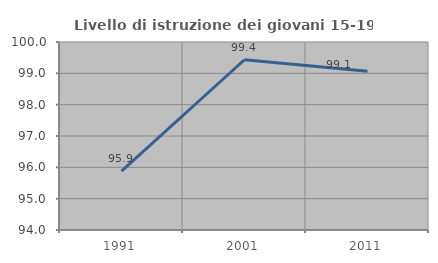
| Category | Livello di istruzione dei giovani 15-19 anni |
|---|---|
| 1991.0 | 95.879 |
| 2001.0 | 99.433 |
| 2011.0 | 99.068 |